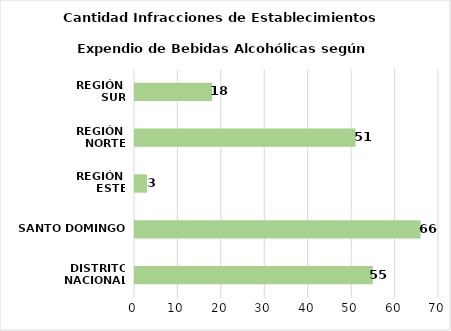
| Category | Series 0 |
|---|---|
| DISTRITO NACIONAL | 55 |
| SANTO DOMINGO | 66 |
| REGIÓN 
ESTE | 3 |
| REGIÓN 
NORTE | 51 |
| REGIÓN 
SUR | 18 |